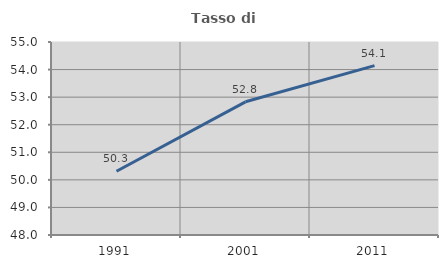
| Category | Tasso di occupazione   |
|---|---|
| 1991.0 | 50.313 |
| 2001.0 | 52.831 |
| 2011.0 | 54.141 |